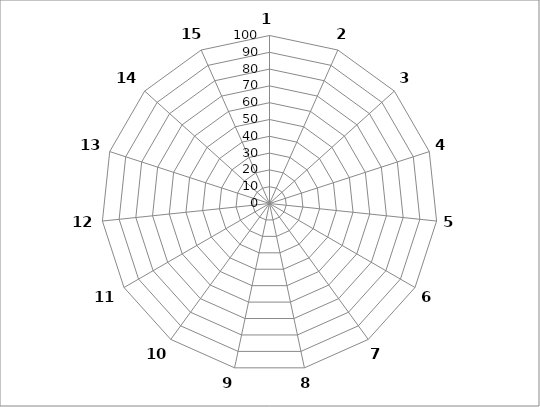
| Category | Series 0 |
|---|---|
| 1.0 | 0 |
| 2.0 | 0 |
| 3.0 | 0 |
| 4.0 | 0 |
| 5.0 | 0 |
| 6.0 | 0 |
| 7.0 | 0 |
| 8.0 | 0 |
| 9.0 | 0 |
| 10.0 | 0 |
| 11.0 | 0 |
| 12.0 | 0 |
| 13.0 | 0 |
| 14.0 | 0 |
| 15.0 | 0 |